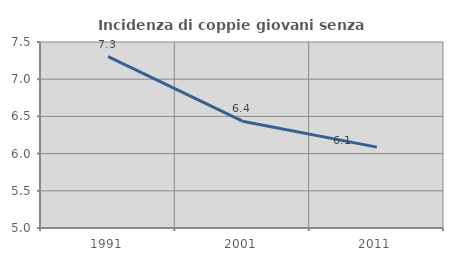
| Category | Incidenza di coppie giovani senza figli |
|---|---|
| 1991.0 | 7.303 |
| 2001.0 | 6.436 |
| 2011.0 | 6.087 |